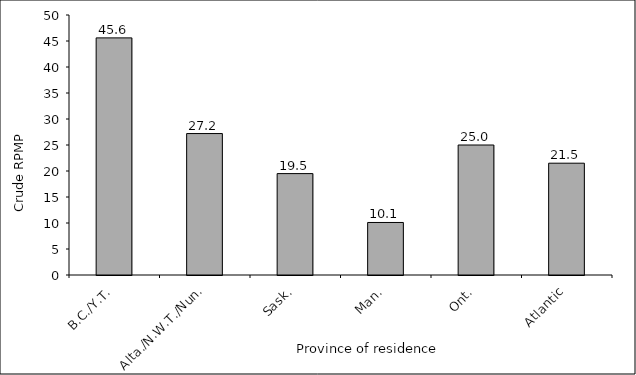
| Category | Crude RPMP |
|---|---|
| B.C./Y.T. | 45.6 |
| Alta./N.W.T./Nun. | 27.2 |
| Sask. | 19.5 |
| Man. | 10.1 |
| Ont. | 25 |
| Atlantic | 21.5 |